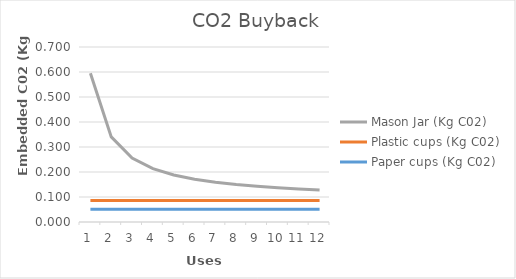
| Category | Paper cups (Kg C02) | Plastic cups (Kg C02) | Mason Jar (Kg C02) |
|---|---|---|---|
| 0 | 0.051 | 0.035 | 0.509 |
| 1 | 0.051 | 0.035 | 0.254 |
| 2 | 0.051 | 0.035 | 0.17 |
| 3 | 0.051 | 0.035 | 0.127 |
| 4 | 0.051 | 0.035 | 0.102 |
| 5 | 0.051 | 0.035 | 0.085 |
| 6 | 0.051 | 0.035 | 0.073 |
| 7 | 0.051 | 0.035 | 0.064 |
| 8 | 0.051 | 0.035 | 0.057 |
| 9 | 0.051 | 0.035 | 0.051 |
| 10 | 0.051 | 0.035 | 0.046 |
| 11 | 0.051 | 0.035 | 0.042 |